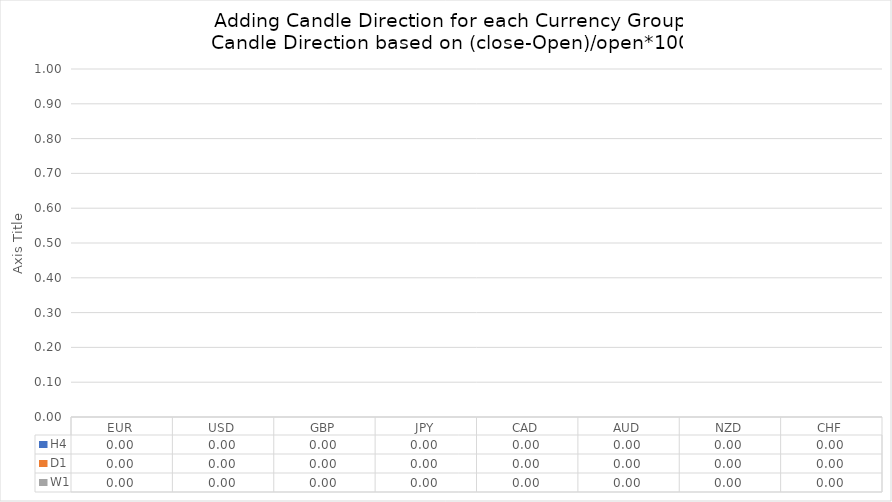
| Category | H4 | D1 | W1 |
|---|---|---|---|
| EUR | 0 | 0 | 0 |
| USD | 0 | 0 | 0 |
| GBP | 0 | 0 | 0 |
| JPY | 0 | 0 | 0 |
| CAD | 0 | 0 | 0 |
| AUD | 0 | 0 | 0 |
| NZD | 0 | 0 | 0 |
| CHF | 0 | 0 | 0 |